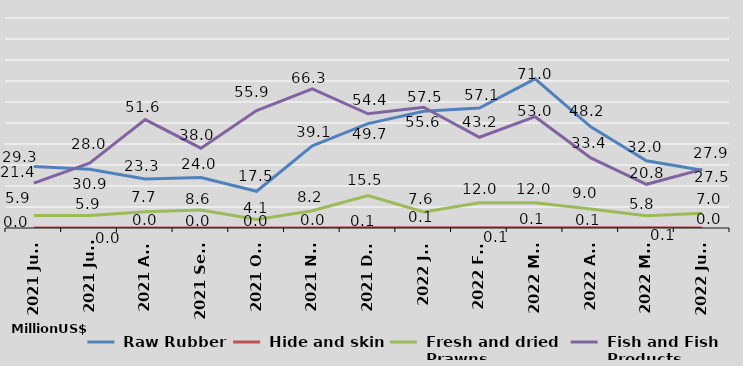
| Category |  Raw Rubber |  Hide and skin |  Fresh and dried
 Prawns |  Fish and Fish
 Products |
|---|---|---|---|---|
| 2021 June | 29.3 | 0 | 5.9 | 21.4 |
| 2021 July | 28 | 0 | 5.9 | 30.9 |
| 2021 Aug | 23.3 | 0 | 7.7 | 51.6 |
| 2021 Sept | 24 | 0 | 8.6 | 38 |
| 2021 Oct | 17.5 | 0 | 4.1 | 55.9 |
| 2021 Nov | 39.1 | 0 | 8.2 | 66.3 |
| 2021 Dec | 49.7 | 0.1 | 15.5 | 54.4 |
| 2022 Jan | 55.6 | 0.1 | 7.6 | 57.5 |
| 2022 Feb | 57.1 | 0.1 | 12 | 43.2 |
| 2022 Mar | 71 | 0.1 | 12 | 53 |
| 2022 Apr | 48.2 | 0.1 | 9 | 33.4 |
| 2022 May | 32 | 0.1 | 5.8 | 20.8 |
| 2022 June | 27.5 | 0 | 7 | 27.9 |